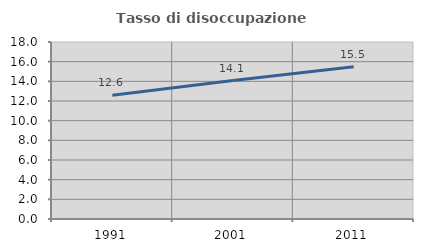
| Category | Tasso di disoccupazione giovanile  |
|---|---|
| 1991.0 | 12.583 |
| 2001.0 | 14.085 |
| 2011.0 | 15.493 |